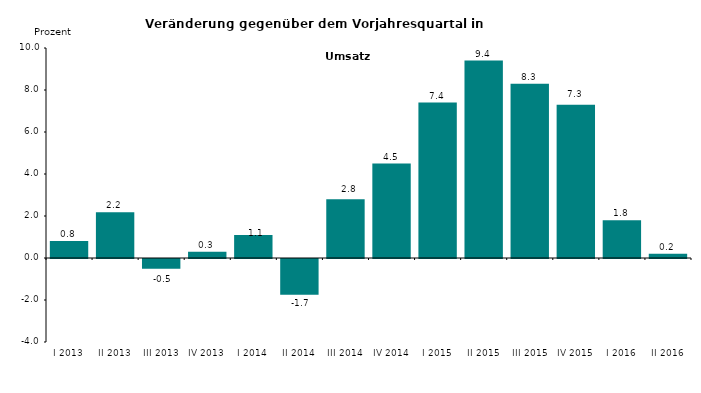
| Category | Series 0 |
|---|---|
| I 2013 | 0.81 |
| II 2013 | 2.181 |
| III 2013 | -0.465 |
| IV 2013 | 0.3 |
| I 2014 | 1.1 |
| II 2014 | -1.7 |
| III 2014 | 2.8 |
| IV 2014 | 4.5 |
| I 2015 | 7.4 |
| II 2015 | 9.4 |
| III 2015 | 8.3 |
| IV 2015 | 7.3 |
| I 2016 | 1.8 |
| II 2016 | 0.2 |